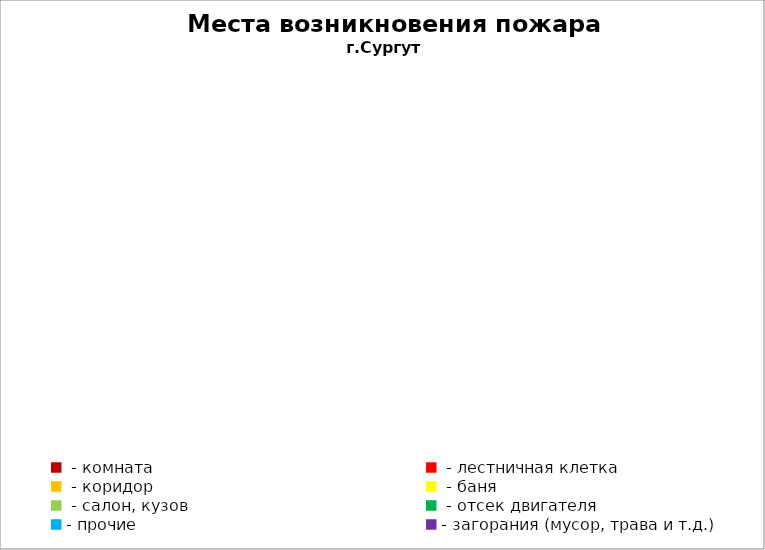
| Category | Места возникновения пожара |
|---|---|
|  - комната | 42 |
|  - лестничная клетка | 11 |
|  - коридор | 6 |
|  - баня | 17 |
|  - салон, кузов | 7 |
|  - отсек двигателя | 13 |
| - прочие | 68 |
| - загорания (мусор, трава и т.д.)  | 126 |